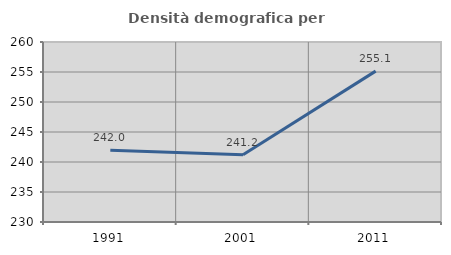
| Category | Densità demografica |
|---|---|
| 1991.0 | 241.97 |
| 2001.0 | 241.195 |
| 2011.0 | 255.148 |